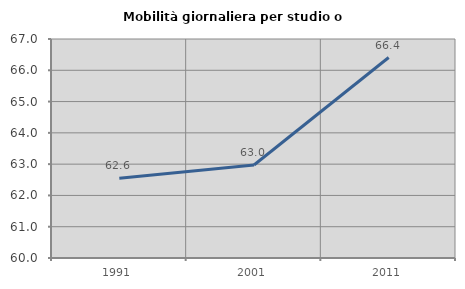
| Category | Mobilità giornaliera per studio o lavoro |
|---|---|
| 1991.0 | 62.552 |
| 2001.0 | 62.974 |
| 2011.0 | 66.407 |